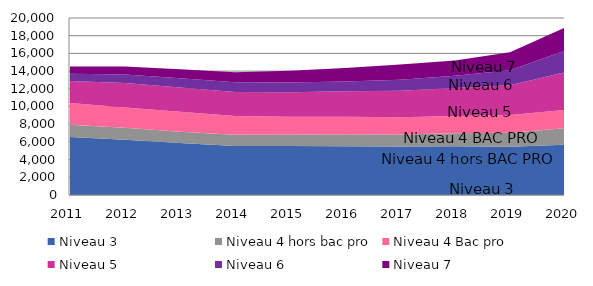
| Category | Niveau 3 | Niveau 4 hors bac pro | Niveau 4 Bac pro | Niveau 5 | Niveau 6 | Niveau 7 |
|---|---|---|---|---|---|---|
| 2011 | 6560 | 1382 | 2440 | 2506 | 823 | 797 |
| 2012 | 6231 | 1357 | 2285 | 2781 | 949 | 906 |
| 2013 | 5884 | 1271 | 2265 | 2717 | 1062 | 1003 |
| 2014 | 5549 | 1265 | 2117 | 2715 | 1082 | 1154 |
| 2015 | 5534 | 1307 | 2012 | 2750 | 1101 | 1334 |
| 2016 | 5511 | 1350 | 1971 | 2889 | 1109 | 1508 |
| 2017 | 5479 | 1346 | 1954 | 3002 | 1253 | 1706 |
| 2018 | 5497 | 1486 | 1944 | 3174 | 1360 | 1742 |
| 2019 | 5453 | 1575 | 2007 | 3370 | 1691 | 2023 |
| 2020 | 5680 | 1875 | 2060 | 4250 | 2448 | 2621 |